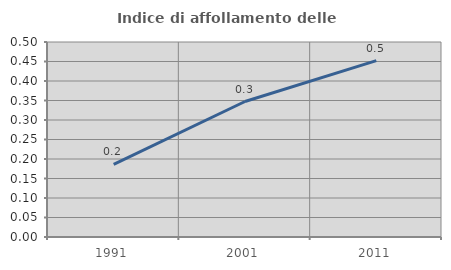
| Category | Indice di affollamento delle abitazioni  |
|---|---|
| 1991.0 | 0.186 |
| 2001.0 | 0.347 |
| 2011.0 | 0.452 |